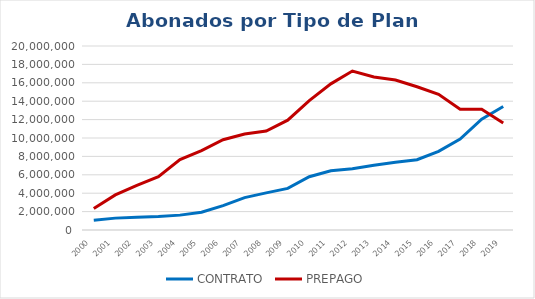
| Category | CONTRATO | PREPAGO |
|---|---|---|
| 2000.0 | 1068130 | 2333395 |
| 2001.0 | 1290852 | 3809931 |
| 2002.0 | 1382871 | 4861439 |
| 2003.0 | 1473310 | 5794971 |
| 2004.0 | 1616653 | 7644732 |
| 2005.0 | 1931459 | 8638113 |
| 2006.0 | 2644224 | 9806577 |
| 2007.0 | 3523166 | 10432036 |
| 2008.0 | 4033678 | 10762915 |
| 2009.0 | 4517200 | 11933023 |
| 2010.0 | 5786405 | 14065837 |
| 2011.0 | 6429681 | 15885567 |
| 2012.0 | 6657716 | 17283257 |
| 2013.0 | 7031350 | 16629989 |
| 2014.0 | 7375577 | 16305141 |
| 2015.0 | 7638385 | 15567968 |
| 2016.0 | 8556131 | 14746472 |
| 2017.0 | 9878035 | 13135112 |
| 2018.0 | 12051532 | 13127449 |
| 2019.0 | 13431953 | 11619715 |